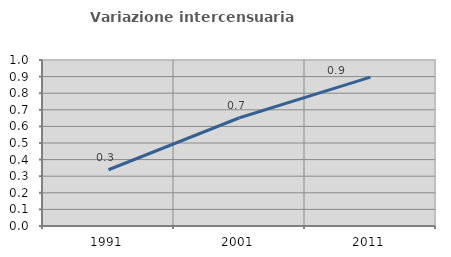
| Category | Variazione intercensuaria annua |
|---|---|
| 1991.0 | 0.339 |
| 2001.0 | 0.652 |
| 2011.0 | 0.897 |